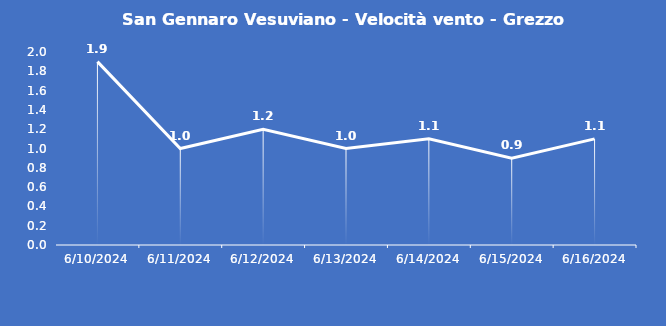
| Category | San Gennaro Vesuviano - Velocità vento - Grezzo (m/s) |
|---|---|
| 6/10/24 | 1.9 |
| 6/11/24 | 1 |
| 6/12/24 | 1.2 |
| 6/13/24 | 1 |
| 6/14/24 | 1.1 |
| 6/15/24 | 0.9 |
| 6/16/24 | 1.1 |